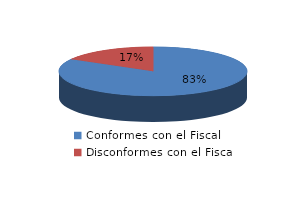
| Category | Series 0 |
|---|---|
| 0 | 194 |
| 1 | 39 |